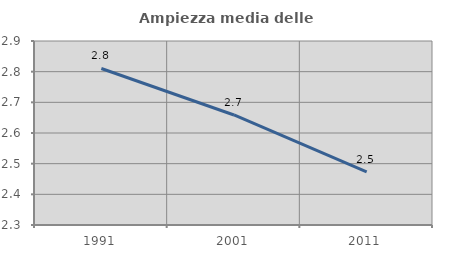
| Category | Ampiezza media delle famiglie |
|---|---|
| 1991.0 | 2.81 |
| 2001.0 | 2.659 |
| 2011.0 | 2.473 |